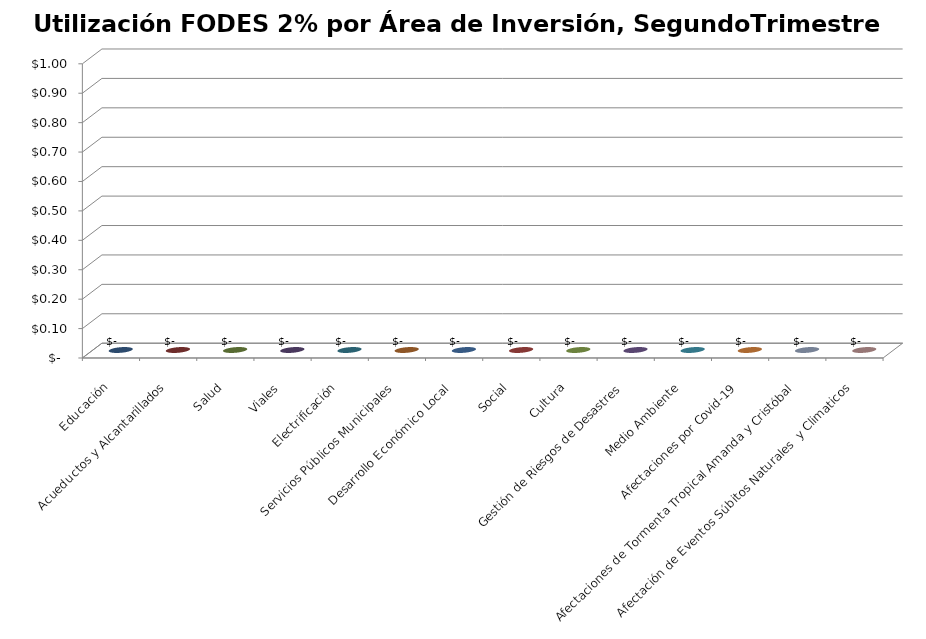
| Category | Educación |
|---|---|
| Educación | 0 |
| Acueductos y Alcantarillados | 0 |
| Salud | 0 |
| Viales | 0 |
| Electrificación | 0 |
| Servicios Públicos Municipales | 0 |
| Desarrollo Económico Local | 0 |
| Social | 0 |
| Cultura | 0 |
| Gestión de Riesgos de Desastres | 0 |
| Medio Ambiente | 0 |
| Afectaciones por Covid-19 | 0 |
| Afectaciones de Tormenta Tropical Amanda y Cristóbal | 0 |
| Afectación de Eventos Súbitos Naturales  y Climaticos | 0 |